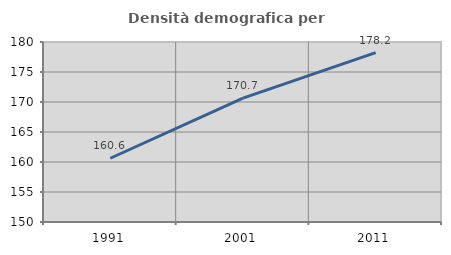
| Category | Densità demografica |
|---|---|
| 1991.0 | 160.624 |
| 2001.0 | 170.659 |
| 2011.0 | 178.221 |